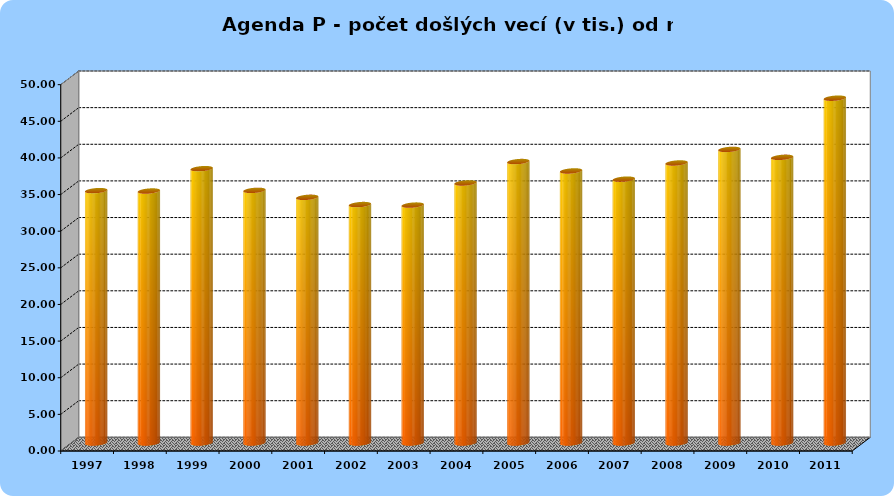
| Category | Series 1 |
|---|---|
| 1997.0 | 34.44 |
| 1998.0 | 34.39 |
| 1999.0 | 37.44 |
| 2000.0 | 34.48 |
| 2001.0 | 33.53 |
| 2002.0 | 32.54 |
| 2003.0 | 32.47 |
| 2004.0 | 35.49 |
| 2005.0 | 38.41 |
| 2006.0 | 37.13 |
| 2007.0 | 36.01 |
| 2008.0 | 38.22 |
| 2009.0 | 40.07 |
| 2010.0 | 38.99 |
| 2011.0 | 47.06 |